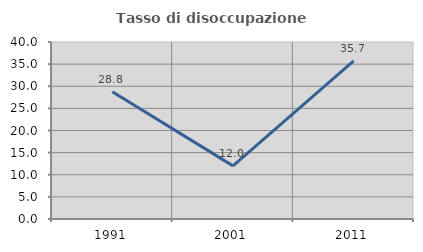
| Category | Tasso di disoccupazione giovanile  |
|---|---|
| 1991.0 | 28.767 |
| 2001.0 | 12 |
| 2011.0 | 35.714 |